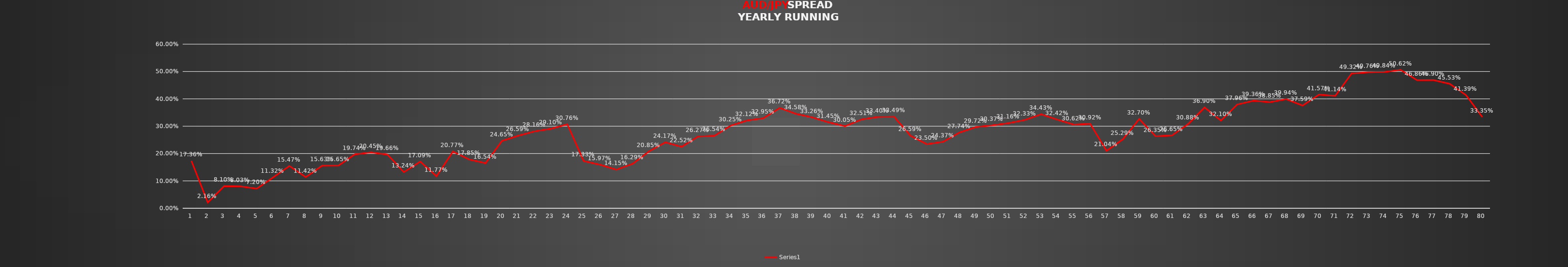
| Category | Series 1 |
|---|---|
| 0 | 0.174 |
| 1 | 0.022 |
| 2 | 0.081 |
| 3 | 0.08 |
| 4 | 0.072 |
| 5 | 0.113 |
| 6 | 0.155 |
| 7 | 0.114 |
| 8 | 0.156 |
| 9 | 0.156 |
| 10 | 0.197 |
| 11 | 0.204 |
| 12 | 0.197 |
| 13 | 0.132 |
| 14 | 0.171 |
| 15 | 0.118 |
| 16 | 0.208 |
| 17 | 0.178 |
| 18 | 0.165 |
| 19 | 0.246 |
| 20 | 0.266 |
| 21 | 0.282 |
| 22 | 0.291 |
| 23 | 0.308 |
| 24 | 0.173 |
| 25 | 0.16 |
| 26 | 0.142 |
| 27 | 0.163 |
| 28 | 0.208 |
| 29 | 0.242 |
| 30 | 0.225 |
| 31 | 0.263 |
| 32 | 0.265 |
| 33 | 0.302 |
| 34 | 0.321 |
| 35 | 0.33 |
| 36 | 0.367 |
| 37 | 0.346 |
| 38 | 0.333 |
| 39 | 0.314 |
| 40 | 0.3 |
| 41 | 0.325 |
| 42 | 0.334 |
| 43 | 0.335 |
| 44 | 0.266 |
| 45 | 0.235 |
| 46 | 0.244 |
| 47 | 0.277 |
| 48 | 0.297 |
| 49 | 0.304 |
| 50 | 0.312 |
| 51 | 0.323 |
| 52 | 0.344 |
| 53 | 0.324 |
| 54 | 0.306 |
| 55 | 0.309 |
| 56 | 0.21 |
| 57 | 0.253 |
| 58 | 0.327 |
| 59 | 0.264 |
| 60 | 0.266 |
| 61 | 0.309 |
| 62 | 0.369 |
| 63 | 0.321 |
| 64 | 0.38 |
| 65 | 0.394 |
| 66 | 0.388 |
| 67 | 0.399 |
| 68 | 0.376 |
| 69 | 0.416 |
| 70 | 0.411 |
| 71 | 0.493 |
| 72 | 0.498 |
| 73 | 0.498 |
| 74 | 0.506 |
| 75 | 0.469 |
| 76 | 0.469 |
| 77 | 0.455 |
| 78 | 0.414 |
| 79 | 0.334 |